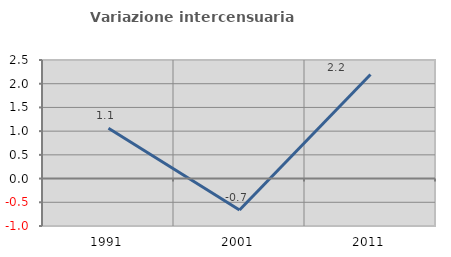
| Category | Variazione intercensuaria annua |
|---|---|
| 1991.0 | 1.059 |
| 2001.0 | -0.664 |
| 2011.0 | 2.196 |